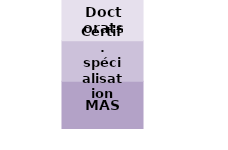
| Category | MAS | Certif. spécialisation | Doctorats |
|---|---|---|---|
| 0 | 409 | 343 | 342 |